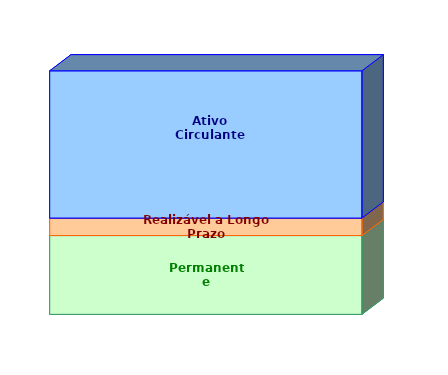
| Category | Permanente | Realizável a Longo Prazo | Ativo Circulante |
|---|---|---|---|
| 0 | 0.324 | 0.072 | 0.605 |